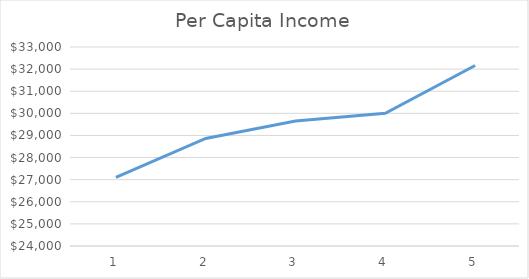
| Category | Series 0 |
|---|---|
| 0 | 27105.928 |
| 1 | 28866.169 |
| 2 | 29655.098 |
| 3 | 30001.257 |
| 4 | 32162.911 |